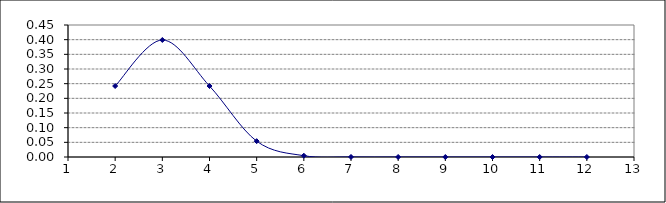
| Category | Series 0 |
|---|---|
| 2.0 | 0.242 |
| 3.0 | 0.399 |
| 4.0 | 0.242 |
| 5.0 | 0.054 |
| 6.0 | 0.004 |
| 7.0 | 0 |
| 8.0 | 0 |
| 9.0 | 0 |
| 10.0 | 0 |
| 11.0 | 0 |
| 12.0 | 0 |